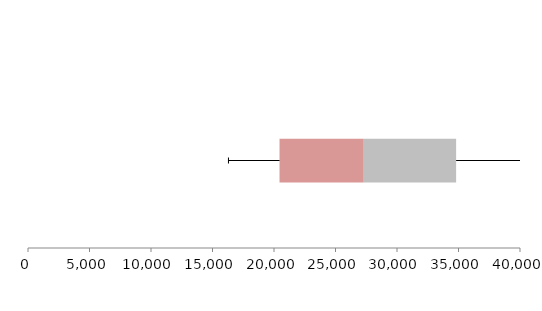
| Category | Series 1 | Series 2 | Series 3 |
|---|---|---|---|
| 0 | 20449.753 | 6849.104 | 7507.883 |